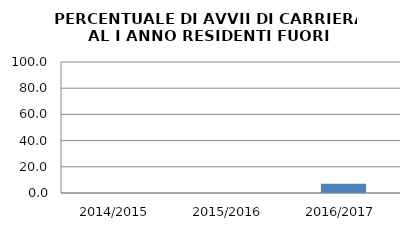
| Category | 2014/2015 2015/2016 2016/2017 |
|---|---|
| 2014/2015 | 0 |
| 2015/2016 | 0 |
| 2016/2017 | 7.143 |